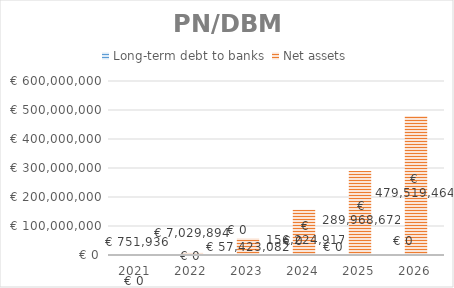
| Category | Long-term debt to banks | Net assets |
|---|---|---|
| 2021.0 | 0 | 751936.361 |
| 2022.0 | 0 | 7029894.054 |
| 2023.0 | 0 | 57423082.249 |
| 2024.0 | 0 | 156224917.235 |
| 2025.0 | 0 | 289968671.846 |
| 2026.0 | 0 | 479519463.774 |